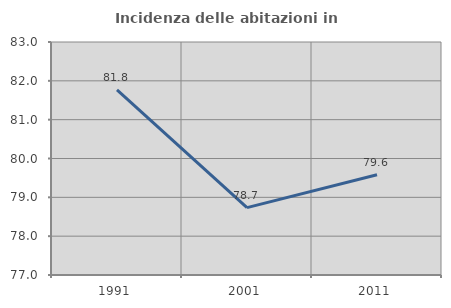
| Category | Incidenza delle abitazioni in proprietà  |
|---|---|
| 1991.0 | 81.768 |
| 2001.0 | 78.736 |
| 2011.0 | 79.581 |